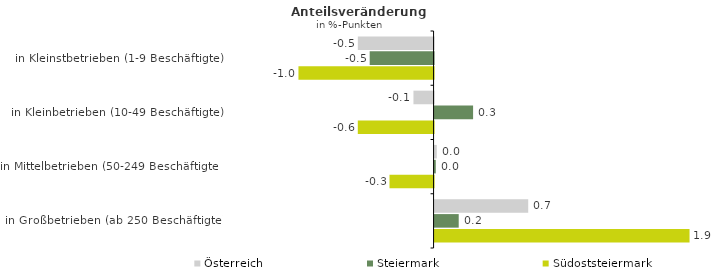
| Category | Österreich | Steiermark | Südoststeiermark |
|---|---|---|---|
| in Kleinstbetrieben (1-9 Beschäftigte) | -0.55 | -0.464 | -0.981 |
| in Kleinbetrieben (10-49 Beschäftigte) | -0.146 | 0.28 | -0.55 |
| in Mittelbetrieben (50-249 Beschäftigte) | 0.016 | 0.009 | -0.32 |
| in Großbetrieben (ab 250 Beschäftigte) | 0.68 | 0.175 | 1.851 |